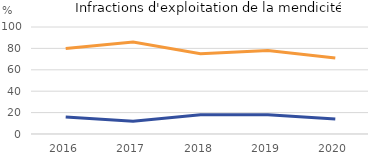
| Category | Part des victimes mineures française | Part des victimes mineures |
|---|---|---|
| 2016.0 | 16 | 80 |
| 2017.0 | 12 | 86 |
| 2018.0 | 18 | 75 |
| 2019.0 | 18 | 78 |
| 2020.0 | 14 | 71 |